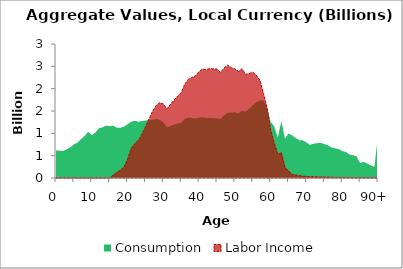
| Category | Consumption | Labor Income |
|---|---|---|
| 0 | 615.76 | 0 |
|  | 611.781 | 0 |
| 2 | 602.587 | 0 |
| 3 | 642.095 | 0 |
| 4 | 686.053 | 0 |
| 5 | 753.419 | 0 |
| 6 | 789.141 | 0 |
| 7 | 870.639 | 0 |
| 8 | 941.675 | 0 |
| 9 | 1037.658 | 0 |
| 10 | 959.229 | 0 |
| 11 | 1017.161 | 0 |
| 12 | 1113.058 | 0 |
| 13 | 1132.268 | 0 |
| 14 | 1173.39 | 0 |
| 15 | 1158.925 | 0 |
| 16 | 1173.254 | 68.371 |
| 17 | 1124.557 | 125.633 |
| 18 | 1123.348 | 177.589 |
| 19 | 1150.544 | 249.029 |
| 20 | 1203.355 | 420.034 |
| 21 | 1257.97 | 658.578 |
| 22 | 1282.396 | 770.954 |
| 23 | 1260.306 | 841.624 |
| 24 | 1273.461 | 978.297 |
| 25 | 1286.77 | 1149.794 |
| 26 | 1298.015 | 1323.005 |
| 27 | 1303.499 | 1494.516 |
| 28 | 1322.024 | 1626.596 |
| 29 | 1302.803 | 1685.99 |
| 30 | 1246.085 | 1657.116 |
| 31 | 1138.612 | 1545.791 |
| 32 | 1163.903 | 1650.831 |
| 33 | 1194.192 | 1746.416 |
| 34 | 1221.027 | 1836.57 |
| 35 | 1232.729 | 1913.621 |
| 36 | 1322.012 | 2101.905 |
| 37 | 1354.352 | 2208.804 |
| 38 | 1343.937 | 2251.545 |
| 39 | 1331.158 | 2289.467 |
| 40 | 1349.305 | 2384.782 |
| 41 | 1360.286 | 2438.058 |
| 42 | 1342.001 | 2429.458 |
| 43 | 1340.944 | 2448.787 |
| 44 | 1340.204 | 2443.065 |
| 45 | 1339.262 | 2438.167 |
| 46 | 1319.413 | 2364.549 |
| 47 | 1406.131 | 2461.889 |
| 48 | 1464.366 | 2529.07 |
| 49 | 1466.237 | 2469.433 |
| 50 | 1470.73 | 2442.507 |
| 51 | 1450.183 | 2386.253 |
| 52 | 1509.967 | 2446.079 |
| 53 | 1484.799 | 2321.923 |
| 54 | 1554.123 | 2337.87 |
| 55 | 1625.881 | 2369.624 |
| 56 | 1696.095 | 2299.054 |
| 57 | 1736.743 | 2188.74 |
| 58 | 1737.081 | 1895.981 |
| 59 | 1569.786 | 1581.087 |
| 60 | 1256.205 | 1080.388 |
| 61 | 1157.96 | 789.154 |
| 62 | 907.133 | 525.209 |
| 63 | 1273.733 | 571.934 |
| 64 | 880.985 | 244.738 |
| 65 | 997.293 | 162.749 |
| 66 | 955.721 | 82.355 |
| 67 | 895.172 | 66.196 |
| 68 | 847.506 | 52.469 |
| 69 | 842.848 | 41.618 |
| 70 | 796.255 | 35.883 |
| 71 | 741.637 | 28.321 |
| 72 | 768.389 | 28.805 |
| 73 | 779.334 | 25.513 |
| 74 | 785.363 | 24.473 |
| 75 | 761.344 | 21.812 |
| 76 | 735.199 | 19.944 |
| 77 | 682.269 | 16.836 |
| 78 | 665.274 | 15.145 |
| 79 | 649.048 | 13.321 |
| 80 | 603.084 | 11.832 |
| 81 | 584.332 | 10.846 |
| 82 | 527.588 | 8.552 |
| 83 | 509.824 | 8.236 |
| 84 | 486.488 | 7.039 |
| 85 | 335.954 | 4.359 |
| 86 | 361.159 | 4.305 |
| 87 | 325.458 | 3.638 |
| 88 | 280.359 | 2.813 |
| 89 | 250.656 | 2.37 |
| 90+ | 944.747 | 6.93 |